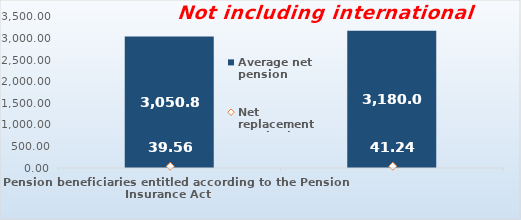
| Category | Average net pension  |
|---|---|
| Pension beneficiaries entitled according to the Pension Insurance Act   | 3050.83 |
| Pension beneficiaries entitled to pension FOR THE FIRST TIME in 2022 according to the Pension Insurance Act  - NEW BENEFICIARIES | 3180.026 |